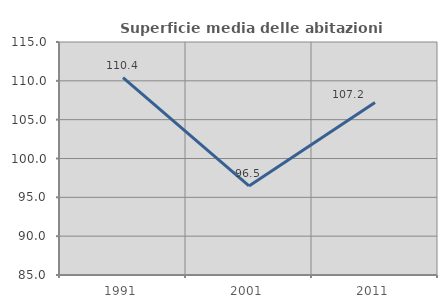
| Category | Superficie media delle abitazioni occupate |
|---|---|
| 1991.0 | 110.399 |
| 2001.0 | 96.466 |
| 2011.0 | 107.212 |